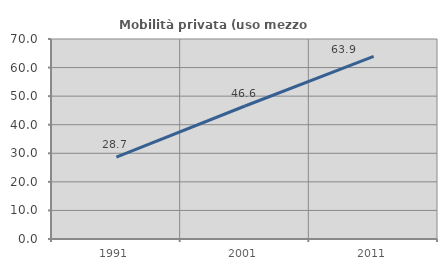
| Category | Mobilità privata (uso mezzo privato) |
|---|---|
| 1991.0 | 28.667 |
| 2001.0 | 46.552 |
| 2011.0 | 63.889 |